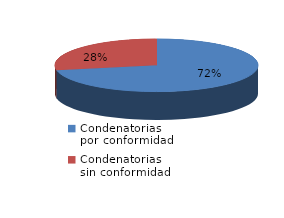
| Category | Series 0 |
|---|---|
| 0 | 701 |
| 1 | 272 |